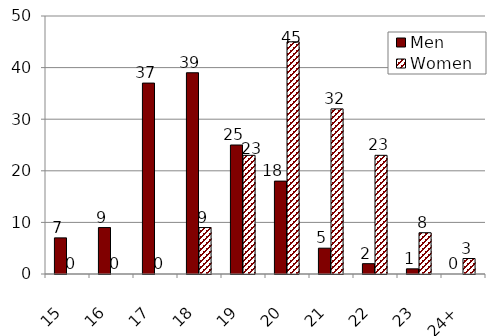
| Category | Men | Women |
|---|---|---|
| 15 | 7 | 0 |
| 16 | 9 | 0 |
| 17 | 37 | 0 |
| 18 | 39 | 9 |
| 19 | 25 | 23 |
| 20 | 18 | 45 |
| 21 | 5 | 32 |
| 22 | 2 | 23 |
| 23 | 1 | 8 |
| 24+ | 0 | 3 |